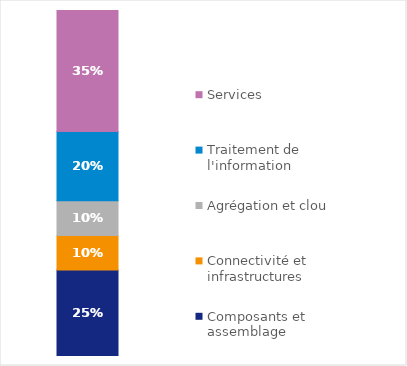
| Category | Composants et assemblage | Connectivité et infrastructures | Agrégation et cloud | Traitement de l'information | Services |
|---|---|---|---|---|---|
| 0 | 0.25 | 0.1 | 0.1 | 0.2 | 0.35 |